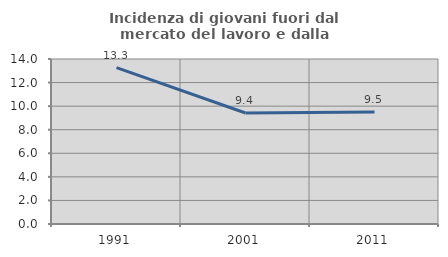
| Category | Incidenza di giovani fuori dal mercato del lavoro e dalla formazione  |
|---|---|
| 1991.0 | 13.262 |
| 2001.0 | 9.418 |
| 2011.0 | 9.5 |